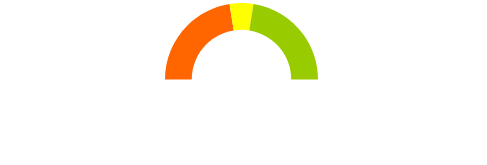
| Category | Series 0 |
|---|---|
| Start | 0 |
| Red | 45 |
| Yellow | 10 |
| End | 45 |
| Blank | 100 |